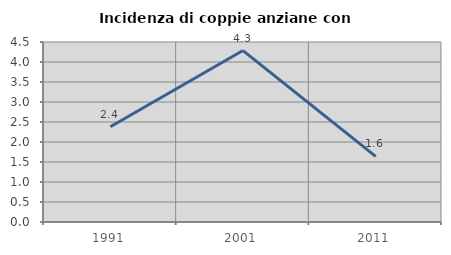
| Category | Incidenza di coppie anziane con figli |
|---|---|
| 1991.0 | 2.381 |
| 2001.0 | 4.286 |
| 2011.0 | 1.639 |